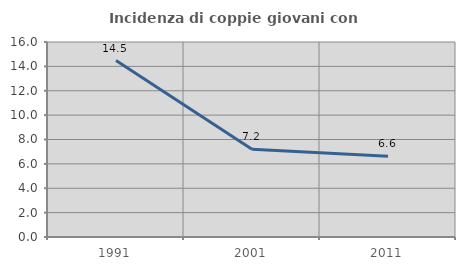
| Category | Incidenza di coppie giovani con figli |
|---|---|
| 1991.0 | 14.479 |
| 2001.0 | 7.193 |
| 2011.0 | 6.629 |